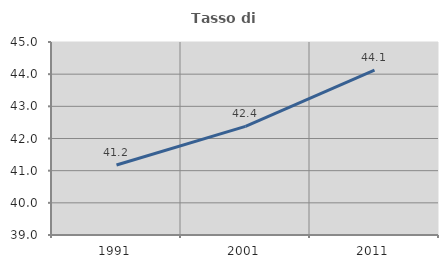
| Category | Tasso di occupazione   |
|---|---|
| 1991.0 | 41.176 |
| 2001.0 | 42.378 |
| 2011.0 | 44.127 |